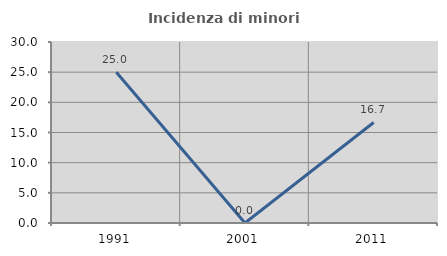
| Category | Incidenza di minori stranieri |
|---|---|
| 1991.0 | 25 |
| 2001.0 | 0 |
| 2011.0 | 16.667 |